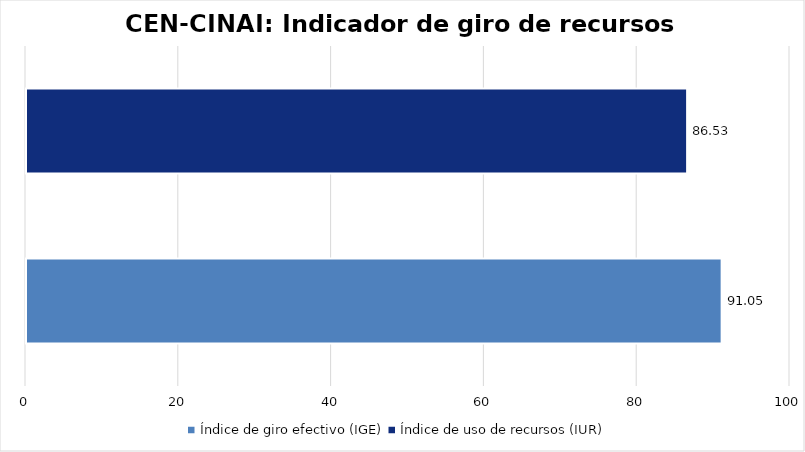
| Category | Series 0 |
|---|---|
| Índice de giro efectivo (IGE) | 91.052 |
| Índice de uso de recursos (IUR)  | 86.532 |